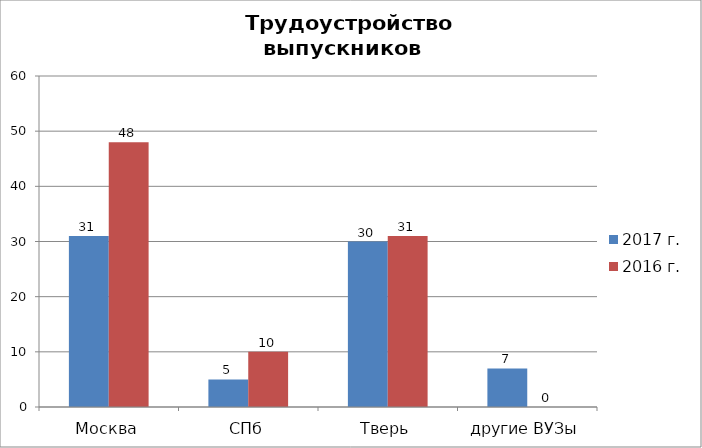
| Category | 2017 г. | 2016 г. |
|---|---|---|
| Москва | 31 | 48 |
| СПб | 5 | 10 |
| Тверь | 30 | 31 |
| другие ВУЗы | 7 | 0 |